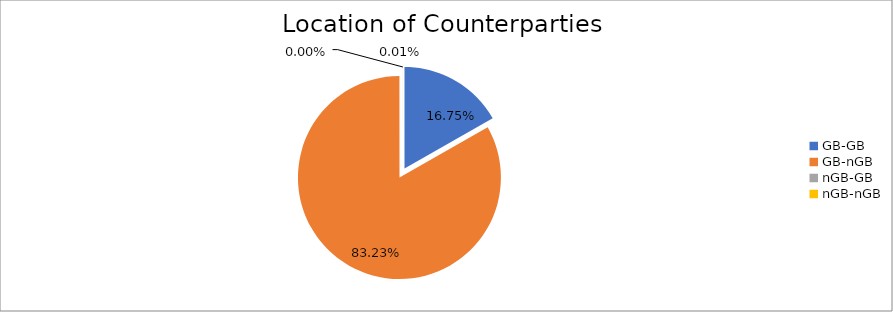
| Category | Series 0 |
|---|---|
| GB-GB | 1179984.356 |
| GB-nGB | 5862749.159 |
| nGB-GB | 121.42 |
| nGB-nGB | 760.919 |